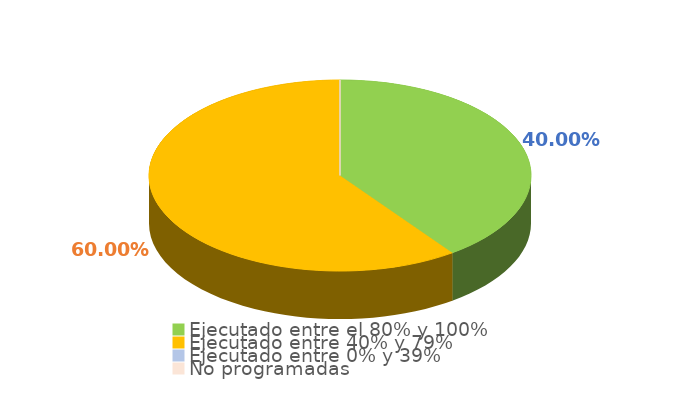
| Category | Series 0 |
|---|---|
| Ejecutado entre el 80% y 100% | 0.4 |
| Ejecutado entre 40% y 79% | 0.6 |
| Ejecutado entre 0% y 39% | 0 |
| No programadas | 0 |